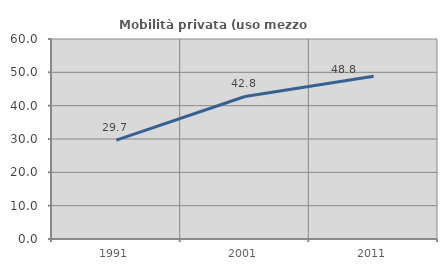
| Category | Mobilità privata (uso mezzo privato) |
|---|---|
| 1991.0 | 29.664 |
| 2001.0 | 42.76 |
| 2011.0 | 48.825 |